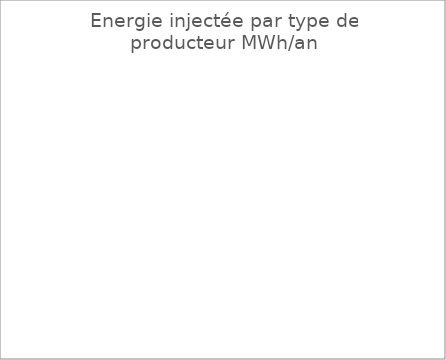
| Category | Energie totale injectée |
|---|---|
| Fatale | 0 |
| Renouvelable - Géothermie | 0 |
| Renouvelable - solaire thermique > 100 m² | 0 |
| Renouvelable - autres | 0 |
| Fossile | 0 |